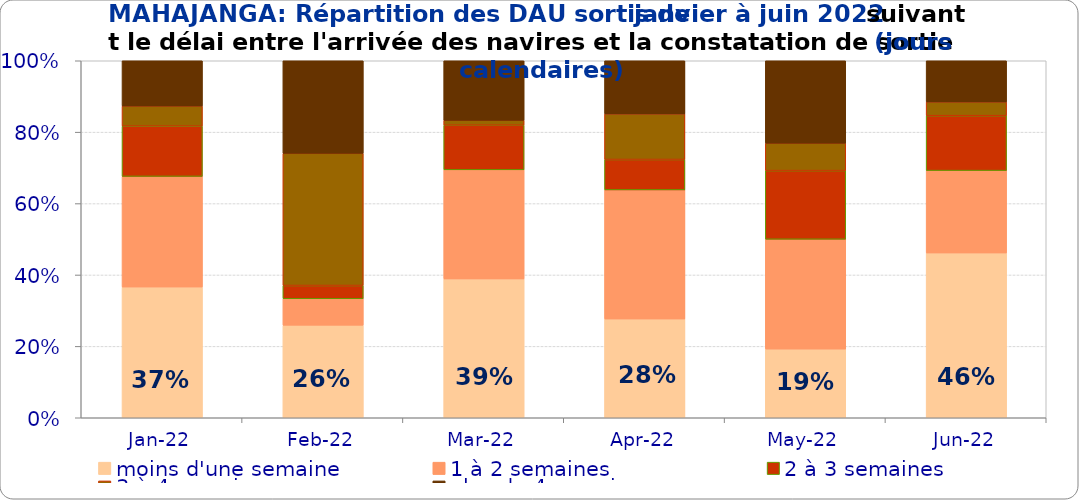
| Category | moins d'une semaine | 1 à 2 semaines | 2 à 3 semaines | 3 à 4 semaines | plus de 4 semaines |
|---|---|---|---|---|---|
| 2022-01-01 | 0.366 | 0.31 | 0.141 | 0.056 | 0.127 |
| 2022-02-01 | 0.259 | 0.074 | 0.037 | 0.37 | 0.259 |
| 2022-03-01 | 0.389 | 0.306 | 0.125 | 0.014 | 0.167 |
| 2022-04-01 | 0.277 | 0.362 | 0.085 | 0.128 | 0.149 |
| 2022-05-01 | 0.192 | 0.308 | 0.192 | 0.077 | 0.231 |
| 2022-06-01 | 0.462 | 0.231 | 0.154 | 0.038 | 0.115 |